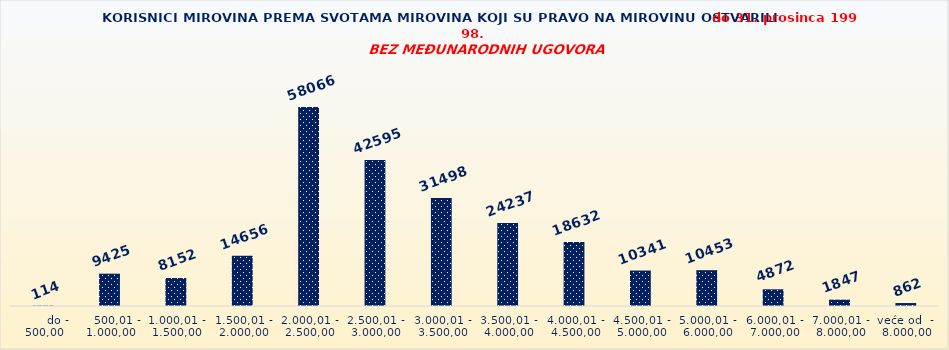
| Category | Series 0 |
|---|---|
|       do - 500,00 | 114 |
|    500,01 - 1.000,00 | 9425 |
| 1.000,01 - 1.500,00 | 8152 |
| 1.500,01 - 2.000,00 | 14656 |
| 2.000,01 - 2.500,00 | 58066 |
| 2.500,01 - 3.000,00 | 42595 |
| 3.000,01 - 3.500,00 | 31498 |
| 3.500,01 - 4.000,00 | 24237 |
| 4.000,01 - 4.500,00 | 18632 |
| 4.500,01 - 5.000,00 | 10341 |
| 5.000,01 - 6.000,00 | 10453 |
| 6.000,01 - 7.000,00 | 4872 |
| 7.000,01 - 8.000,00 | 1847 |
| veće od  -  8.000,00 | 862 |